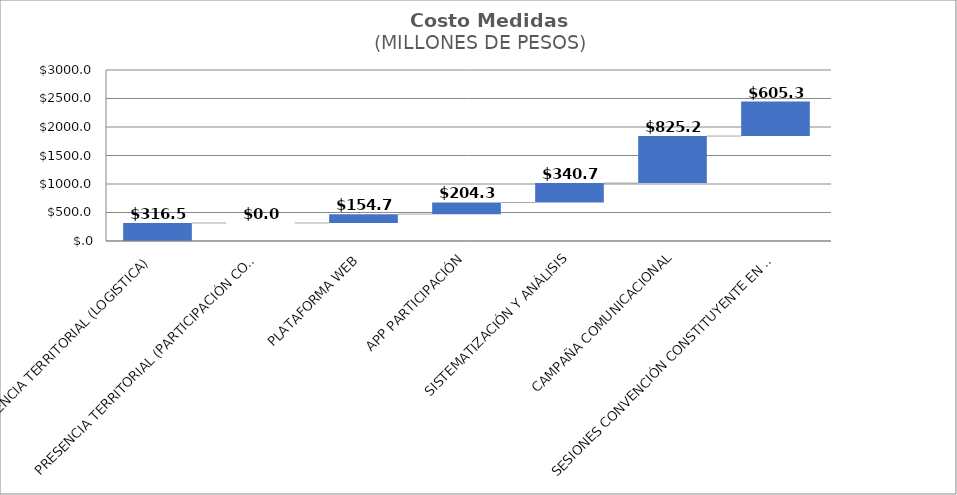
| Category | Alternativa Conservadora  | Alternativa Ambiciosa |
|---|---|---|
| PRESENCIA TERRITORIAL (LOGISTICA) | 316.497 | 7739.276 |
| PRESENCIA TERRITORIAL (PARTICIPACIÓN CONSTITUYENTES) | 0 | 1226.241 |
| PLATAFORMA WEB | 154.737 | 333.237 |
| APP PARTICIPACIÓN | 204.319 | 204.319 |
| SISTEMATIZACIÓN Y ANÁLISIS | 340.721 | 914.183 |
| CAMPAÑA COMUNICACIONAL | 825.228 | 2111.128 |
| SESIONES CONVENCIÓN CONSTITUYENTE EN REGIONES | 605.331 | 1030.451 |
| SUMA TOTAL ALTERNATIVAS | 2446.833 | 13558.834 |